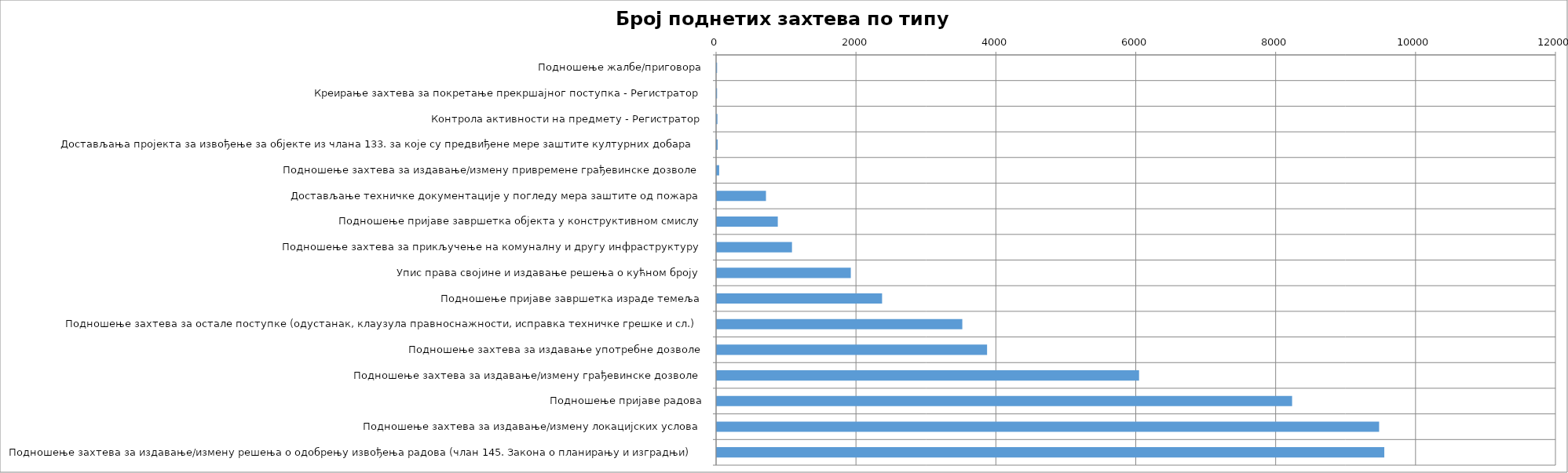
| Category | Број поднетих захтева |
|---|---|
| Подношење жалбе/приговора | 3 |
| Креирање захтева за покретање прекршајног поступка - Регистратор | 3 |
| Контрола активности на предмету - Регистратор | 8 |
| Достављања пројекта за извођење за објекте из члана 133. за које су предвиђене мере заштите културних добара | 11 |
| Подношење захтева за издавање/измену привремене грађевинске дозволе | 33 |
| Достављање техничке документације у погледу мера заштите од пожара | 702 |
| Подношење пријаве завршетка објекта у конструктивном смислу | 871 |
| Подношење захтева за прикључење на комуналну и другу инфраструктуру | 1074 |
| Упис права својине и издавање решења о кућном броју | 1915 |
| Подношење пријаве завршетка израде темеља | 2362 |
| Подношење захтева за остале поступке (одустанак, клаузула правноснажности, исправка техничке грешке и сл.) | 3509 |
| Подношење захтева за издавање употребне дозволе | 3863 |
| Подношење захтева за издавање/измену грађевинске дозволе | 6036 |
| Подношење пријаве радова | 8224 |
| Подношење захтева за издавање/измену локацијских услова | 9468 |
| Подношење захтева за издавање/измену решења о одобрењу извођења радова (члан 145. Закона о планирању и изградњи) | 9542 |